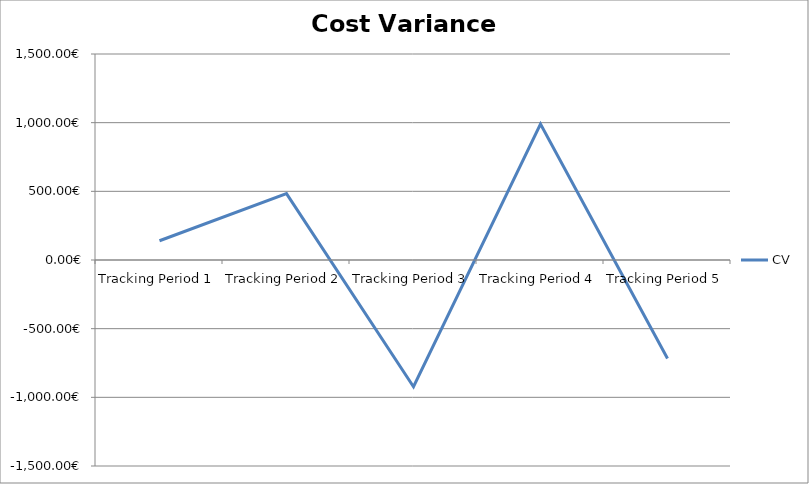
| Category | CV |
|---|---|
| Tracking Period 1 | 140 |
| Tracking Period 2 | 483 |
| Tracking Period 3 | -923 |
| Tracking Period 4 | 990 |
| Tracking Period 5 | -717 |